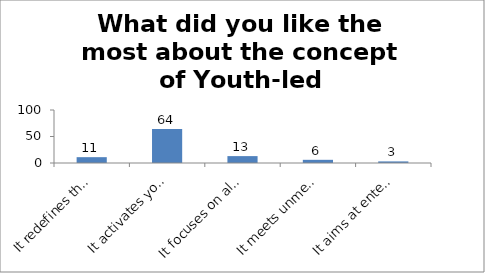
| Category | What did you like the most about the concept of Youth-led Changemaking? |
|---|---|
| It redefines the field of youth development | 11 |
| It activates young people as changemakers | 64 |
| It focuses on all (troubled and prepared) young people | 13 |
| It meets unmet service needs of the society | 6 |
| It aims at enterprising education | 3 |